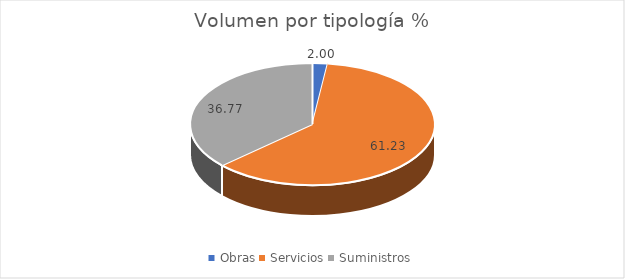
| Category | Series 0 |
|---|---|
| Obras | 1.997 |
| Servicios | 61.231 |
| Suministros | 36.772 |